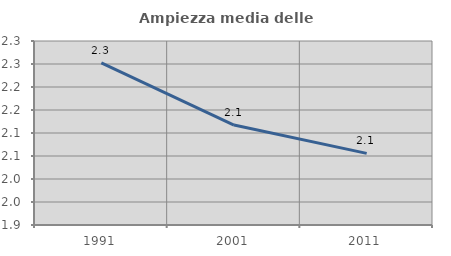
| Category | Ampiezza media delle famiglie |
|---|---|
| 1991.0 | 2.252 |
| 2001.0 | 2.117 |
| 2011.0 | 2.056 |